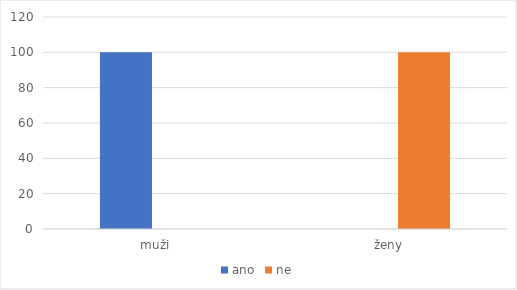
| Category | ano | ne |
|---|---|---|
| muži  | 100 | 0 |
| ženy | 0 | 100 |